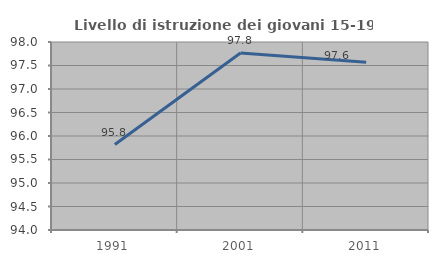
| Category | Livello di istruzione dei giovani 15-19 anni |
|---|---|
| 1991.0 | 95.818 |
| 2001.0 | 97.765 |
| 2011.0 | 97.568 |